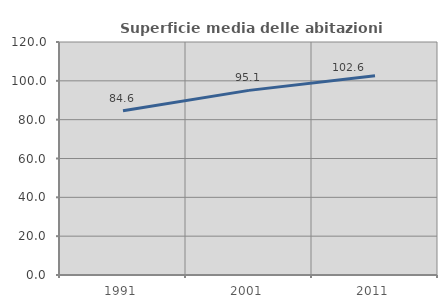
| Category | Superficie media delle abitazioni occupate |
|---|---|
| 1991.0 | 84.607 |
| 2001.0 | 95.082 |
| 2011.0 | 102.62 |